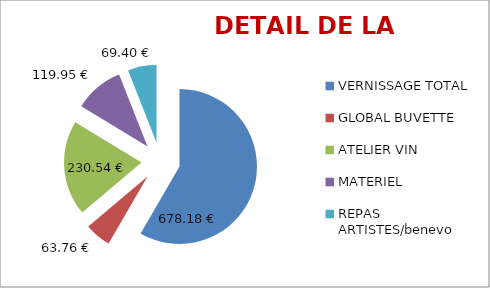
| Category | Series 0 |
|---|---|
| VERNISSAGE TOTAL | 678.18 |
| GLOBAL BUVETTE | 63.76 |
| ATELIER VIN | 230.54 |
| MATERIEL | 119.95 |
| REPAS ARTISTES/benevo | 69.4 |